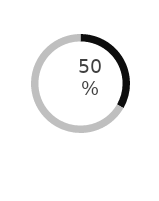
| Category | Series 0 |
|---|---|
| Frauen | 0.499 |
| Prozent | 1 |